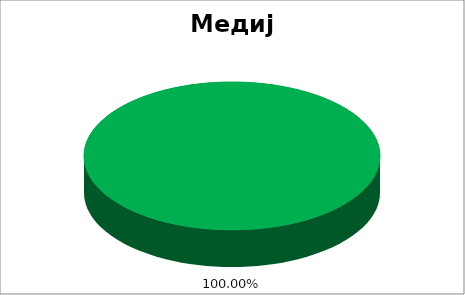
| Category | медији |
|---|---|
| 0 | 1 |
| 1 | 0 |
| 2 | 0 |
| 3 | 0 |
| 4 | 0 |